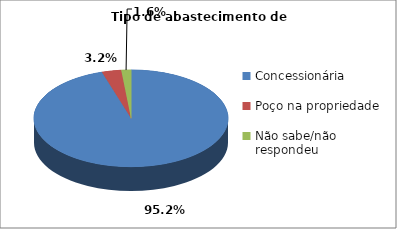
| Category | Series 0 |
|---|---|
| Concessionária | 118 |
| Poço na propriedade | 4 |
| Não sabe/não respondeu | 2 |